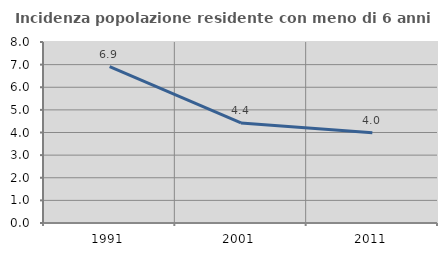
| Category | Incidenza popolazione residente con meno di 6 anni |
|---|---|
| 1991.0 | 6.917 |
| 2001.0 | 4.424 |
| 2011.0 | 3.989 |